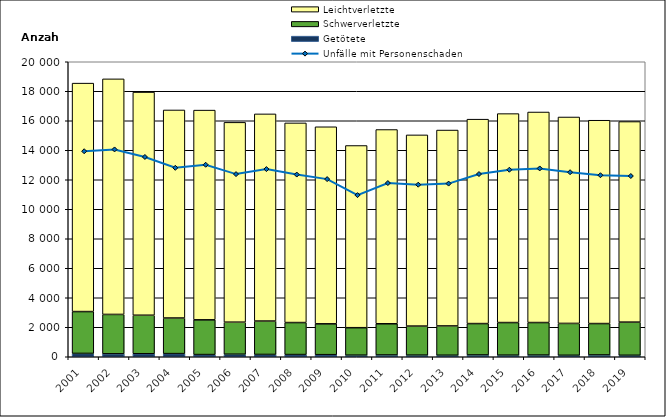
| Category | Getötete | Schwerverletzte | Leichtverletzte |
|---|---|---|---|
| 2001.0 | 226 | 2837 | 15488 |
| 2002.0 | 199 | 2670 | 15971 |
| 2003.0 | 204 | 2611 | 15128 |
| 2004.0 | 212 | 2415 | 14104 |
| 2005.0 | 148 | 2355 | 14219 |
| 2006.0 | 172 | 2173 | 13546 |
| 2007.0 | 156 | 2265 | 14043 |
| 2008.0 | 149 | 2169 | 13535 |
| 2009.0 | 140 | 2092 | 13360 |
| 2010.0 | 108 | 1862 | 12352 |
| 2011.0 | 120 | 2116 | 13169 |
| 2012.0 | 110 | 1970 | 12961 |
| 2013.0 | 103 | 1987 | 13280 |
| 2014.0 | 121 | 2128 | 13858 |
| 2015.0 | 107 | 2211 | 14167 |
| 2016.0 | 114 | 2205 | 14274 |
| 2017.0 | 100 | 2160 | 13995 |
| 2018.0 | 122 | 2129 | 13785 |
| 2019.0 | 100 | 2248 | 13597 |